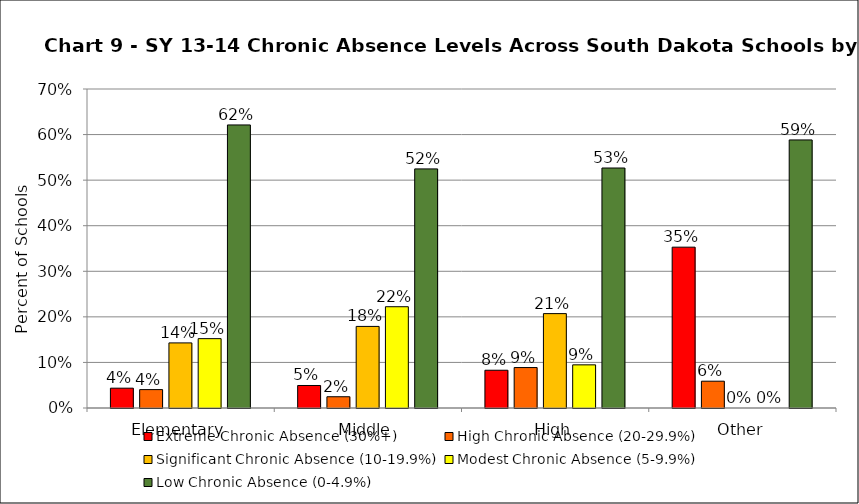
| Category | Extreme Chronic Absence (30%+) | High Chronic Absence (20-29.9%) | Significant Chronic Absence (10-19.9%) | Modest Chronic Absence (5-9.9%) | Low Chronic Absence (0-4.9%) |
|---|---|---|---|---|---|
| 0 | 0.043 | 0.04 | 0.143 | 0.152 | 0.621 |
| 1 | 0.049 | 0.025 | 0.179 | 0.222 | 0.525 |
| 2 | 0.083 | 0.089 | 0.207 | 0.095 | 0.527 |
| 3 | 0.353 | 0.059 | 0 | 0 | 0.588 |